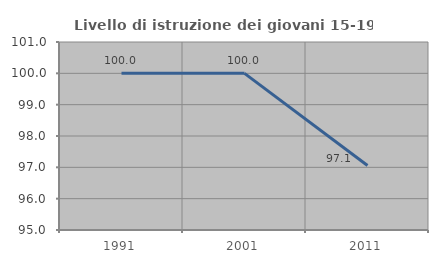
| Category | Livello di istruzione dei giovani 15-19 anni |
|---|---|
| 1991.0 | 100 |
| 2001.0 | 100 |
| 2011.0 | 97.059 |